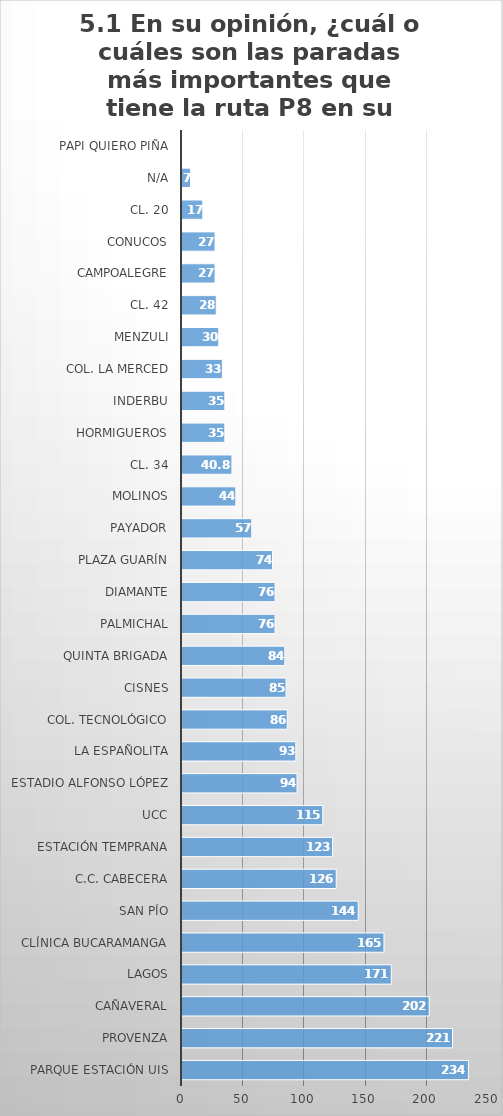
| Category | NUMERO |
|---|---|
| Parque Estación UIS | 234 |
| Provenza | 221 |
| Cañaveral | 202 |
| Lagos | 171 |
| Clínica Bucaramanga | 165 |
| San Pío | 144 |
| C.C. Cabecera | 126 |
| Estación Temprana | 123 |
| UCC | 115 |
| Estadio Alfonso López | 94 |
| La Españolita | 93 |
| Col. Tecnológico | 86 |
| Cisnes | 85 |
| Quinta Brigada | 84 |
| Palmichal | 76 |
| Diamante | 76 |
| Plaza Guarín | 74 |
| Payador | 57 |
| Molinos | 44 |
| Cl. 34 | 40.8 |
| Hormigueros | 35 |
| INDERBU | 35 |
| Col. La Merced | 33 |
| Menzuli | 30 |
| Cl. 42 | 28 |
| Campoalegre | 27 |
| Conucos | 27 |
| Cl. 20 | 17 |
| N/A | 7 |
| Papi Quiero Piña | 0 |